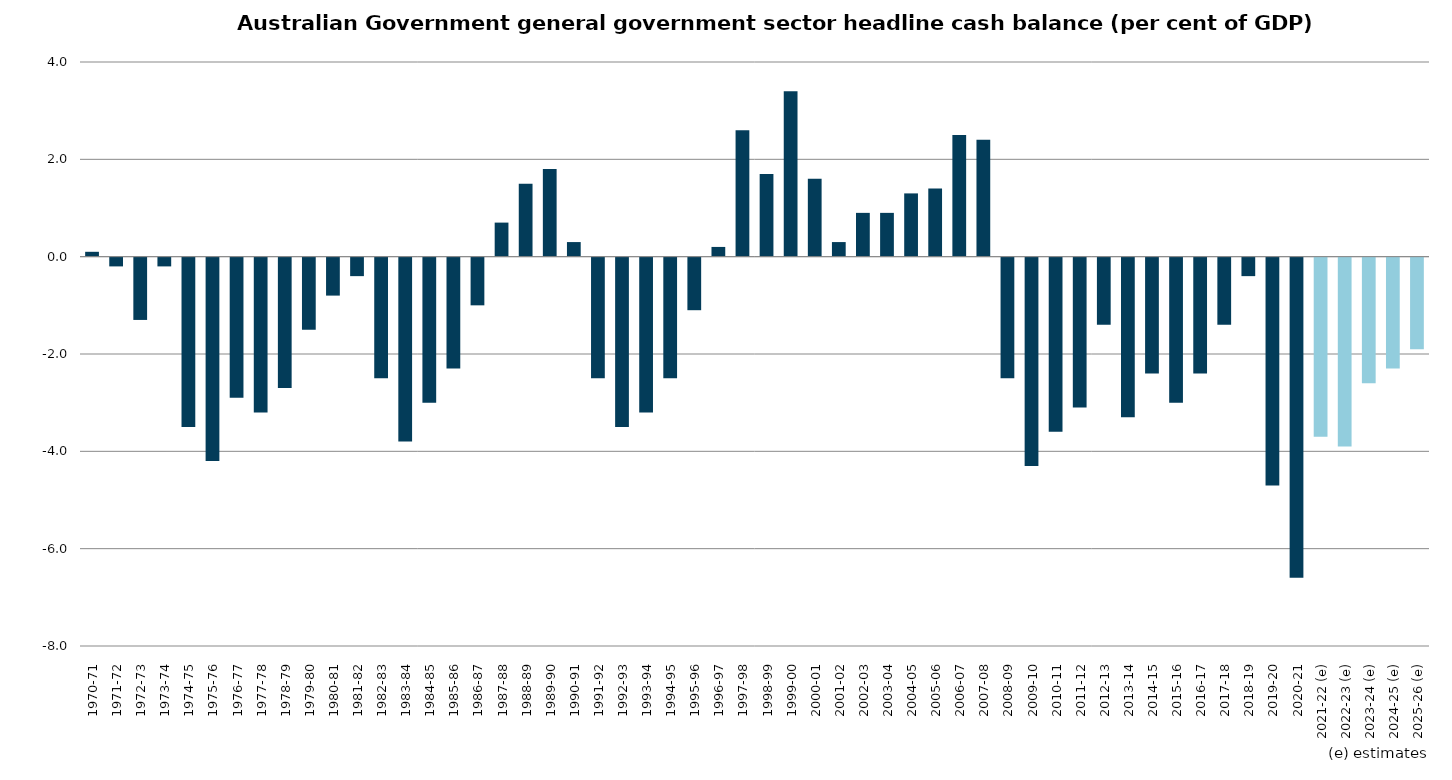
| Category | Series 0 |
|---|---|
| 1970-71 | 0.1 |
| 1971-72 | -0.2 |
| 1972-73 | -1.3 |
| 1973-74 | -0.2 |
| 1974-75 | -3.5 |
| 1975-76 | -4.2 |
| 1976-77 | -2.9 |
| 1977-78 | -3.2 |
| 1978-79 | -2.7 |
| 1979-80 | -1.5 |
| 1980-81 | -0.8 |
| 1981-82 | -0.4 |
| 1982-83 | -2.5 |
| 1983-84 | -3.8 |
| 1984-85 | -3 |
| 1985-86 | -2.3 |
| 1986-87 | -1 |
| 1987-88 | 0.7 |
| 1988-89 | 1.5 |
| 1989-90 | 1.8 |
| 1990-91 | 0.3 |
| 1991-92 | -2.5 |
| 1992-93 | -3.5 |
| 1993-94 | -3.2 |
| 1994-95 | -2.5 |
| 1995-96 | -1.1 |
| 1996-97 | 0.2 |
| 1997-98 | 2.6 |
| 1998-99 | 1.7 |
| 1999-00 | 3.4 |
| 2000-01 | 1.6 |
| 2001-02 | 0.3 |
| 2002-03 | 0.9 |
| 2003-04 | 0.9 |
| 2004-05 | 1.3 |
| 2005-06 | 1.4 |
| 2006-07 | 2.5 |
| 2007-08 | 2.4 |
| 2008-09 | -2.5 |
| 2009-10 | -4.3 |
| 2010-11 | -3.6 |
| 2011-12 | -3.1 |
| 2012-13 | -1.4 |
| 2013-14 | -3.3 |
| 2014-15 | -2.4 |
| 2015-16 | -3 |
| 2016-17 | -2.4 |
| 2017-18 | -1.4 |
| 2018-19 | -0.4 |
| 2019-20 | -4.7 |
| 2020-21 | -6.6 |
| 2021-22 (e) | -3.7 |
| 2022-23 (e) | -3.9 |
| 2023-24 (e) | -2.6 |
| 2024-25 (e) | -2.3 |
| 2025-26 (e) | -1.9 |